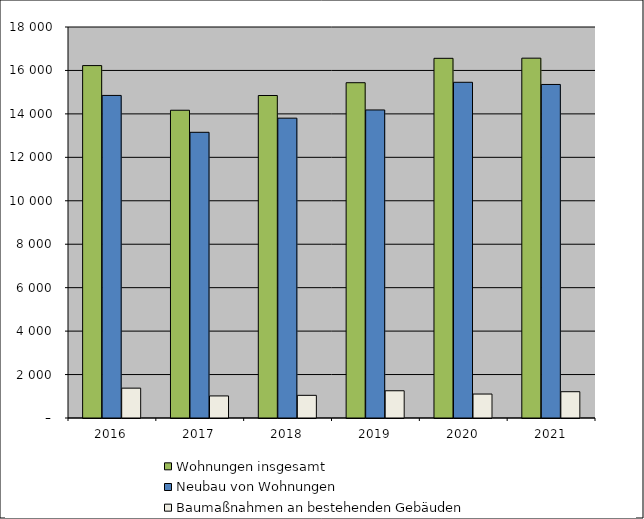
| Category | Wohnungen insgesamt | Neubau von Wohnungen | Baumaßnahmen an bestehenden Gebäuden |
|---|---|---|---|
| 2016.0 | 16224 | 14850 | 1374 |
| 2017.0 | 14168 | 13152 | 1016 |
| 2018.0 | 14846 | 13803 | 1043 |
| 2019.0 | 15435 | 14181 | 1254 |
| 2020.0 | 16558 | 15455 | 1103 |
| 2021.0 | 16565 | 15355 | 1210 |